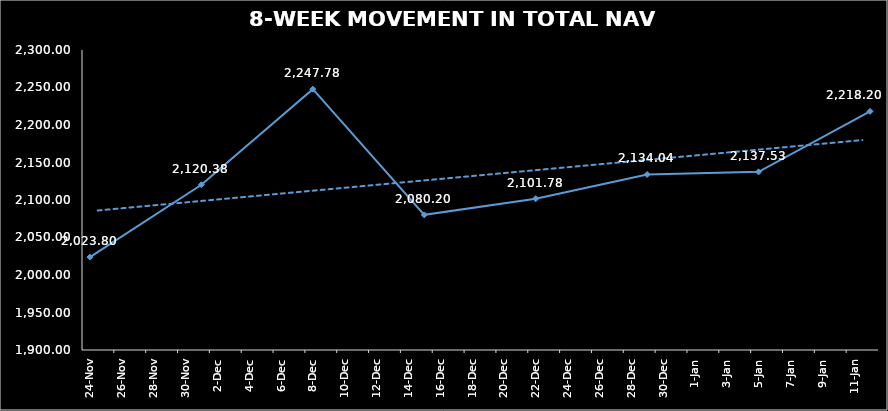
| Category | TOTAL NAV |
|---|---|
| 2023-11-24 | 2023.798 |
| 2023-12-01 | 2120.382 |
| 2023-12-08 | 2247.78 |
| 2023-12-15 | 2080.204 |
| 2023-12-22 | 2101.782 |
| 2023-12-29 | 2134.045 |
| 2024-01-05 | 2137.525 |
| 2024-01-12 | 2218.205 |